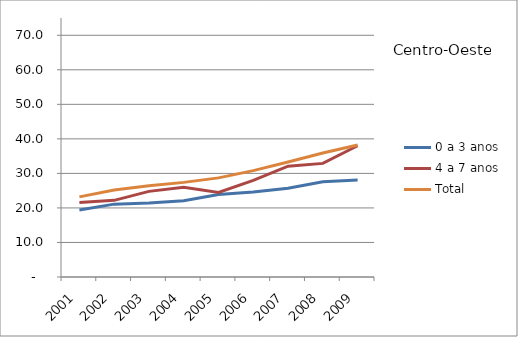
| Category | 0 a 3 anos | 4 a 7 anos | Total |
|---|---|---|---|
| 2001.0 | 19.4 | 21.6 | 23.2 |
| 2002.0 | 21.1 | 22.2 | 25.2 |
| 2003.0 | 21.4 | 24.8 | 26.4 |
| 2004.0 | 22.1 | 26 | 27.4 |
| 2005.0 | 23.9 | 24.5 | 28.7 |
| 2006.0 | 24.6 | 28 | 30.8 |
| 2007.0 | 25.7 | 32.1 | 33.3 |
| 2008.0 | 27.6 | 32.9 | 35.9 |
| 2009.0 | 28.1 | 38 | 38.2 |